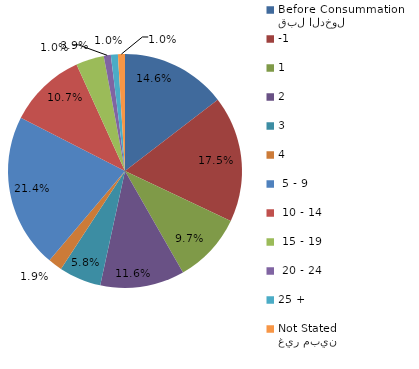
| Category | Series 0 |
|---|---|
| قبل الدخول
Before Consummation | 14.563 |
| -1 | 17.476 |
| 1 | 9.709 |
| 2 | 11.65 |
| 3 | 5.825 |
| 4 | 1.942 |
|  5 - 9 | 21.359 |
|  10 - 14 | 10.68 |
|  15 - 19 | 3.883 |
|  20 - 24 | 0.971 |
| 25 + | 0.971 |
| غير مبين
Not Stated | 0.971 |